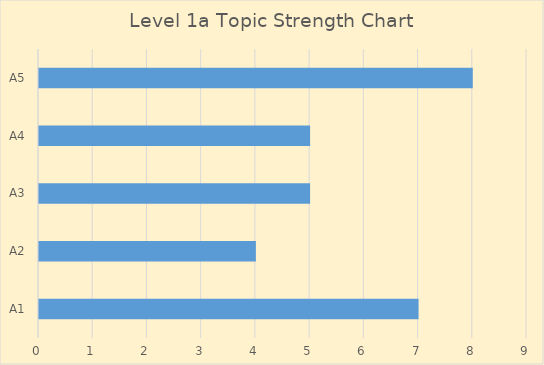
| Category | Series 0 |
|---|---|
| A1 | 7 |
| A2 | 4 |
| A3 | 5 |
| A4 | 5 |
| A5 | 8 |